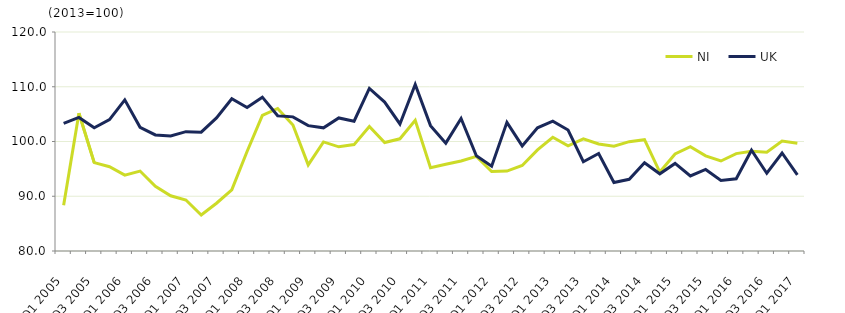
| Category | NI | UK |
|---|---|---|
| Q1 2005 | 88.377 | 103.3 |
| Q2 2005 | 105.176 | 104.4 |
| Q3 2005 | 96.15 | 102.5 |
| Q4 2005 | 95.391 | 104 |
| Q1 2006 | 93.865 | 107.6 |
| Q2 2006 | 94.602 | 102.6 |
| Q3 2006 | 91.809 | 101.2 |
| Q4 2006 | 90.084 | 101 |
| Q1 2007 | 89.321 | 101.8 |
| Q2 2007 | 86.57 | 101.7 |
| Q3 2007 | 88.724 | 104.3 |
| Q4 2007 | 91.164 | 107.8 |
| Q1 2008 | 98.173 | 106.2 |
| Q2 2008 | 104.774 | 108.1 |
| Q3 2008 | 106.032 | 104.7 |
| Q4 2008 | 103.025 | 104.5 |
| Q1 2009 | 95.73 | 102.9 |
| Q2 2009 | 99.925 | 102.5 |
| Q3 2009 | 99.028 | 104.3 |
| Q4 2009 | 99.434 | 103.7 |
| Q1 2010 | 102.726 | 109.7 |
| Q2 2010 | 99.809 | 107.2 |
| Q3 2010 | 100.489 | 103.2 |
| Q4 2010 | 103.871 | 110.4 |
| Q1 2011 | 95.195 | 102.9 |
| Q2 2011 | 95.849 | 99.7 |
| Q3 2011 | 96.448 | 104.2 |
| Q4 2011 | 97.273 | 97.4 |
| Q1 2012 | 94.51 | 95.5 |
| Q2 2012 | 94.59 | 103.5 |
| Q3 2012 | 95.615 | 99.2 |
| Q4 2012 | 98.465 | 102.5 |
| Q1 2013 | 100.777 | 103.7 |
| Q2 2013 | 99.207 | 102.1 |
| Q3 2013 | 100.474 | 96.3 |
| Q4 2013 | 99.542 | 97.8 |
| Q1 2014 | 99.122 | 92.5 |
| Q2 2014 | 99.97 | 93.1 |
| Q3 2014 | 100.328 | 96.1 |
| Q4 2014 | 94.419 | 94.1 |
| Q1 2015 | 97.729 | 96 |
| Q2 2015 | 99.05 | 93.7 |
| Q3 2015 | 97.382 | 94.9 |
| Q4 2015 | 96.439 | 92.9 |
| Q1 2016 | 97.789 | 93.2 |
| Q2 2016 | 98.203 | 98.4 |
| Q3 2016 | 98.048 | 94.2 |
| Q4 2016 | 100.075 | 97.9 |
| Q1 2017 | 99.672 | 93.9 |